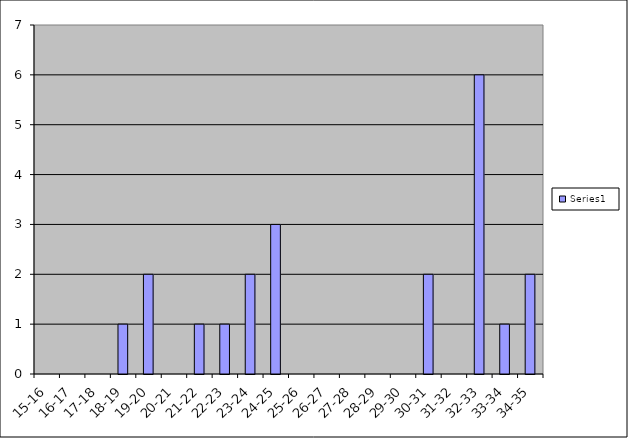
| Category | Series 0 |
|---|---|
| 15-16 | 0 |
| 16-17 | 0 |
| 17-18 | 0 |
| 18-19 | 1 |
| 19-20 | 2 |
| 20-21 | 0 |
| 21-22 | 1 |
| 22-23 | 1 |
| 23-24 | 2 |
| 24-25 | 3 |
| 25-26 | 0 |
| 26-27 | 0 |
| 27-28 | 0 |
| 28-29 | 0 |
| 29-30 | 0 |
| 30-31 | 2 |
| 31-32 | 0 |
| 32-33 | 6 |
| 33-34 | 1 |
| 34-35 | 2 |